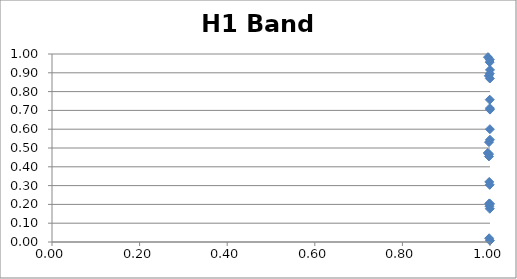
| Category | H1 Band 5 |
|---|---|
| 0.994834886025575 | 0.473 |
| 0.9953766164735058 | 0.983 |
| 0.9972801019672811 | 0.884 |
| 0.9976697690615814 | 0.531 |
| 0.9976730948771776 | 0.455 |
| 0.9979310104615164 | 0.467 |
| 0.9980324808185859 | 0.02 |
| 0.9982690949720863 | 0.319 |
| 0.9984354006671265 | 0.205 |
| 0.9987275360782343 | 0.19 |
| 0.9991885087208351 | 0.957 |
| 0.9993378741743699 | 0.304 |
| 0.9993947804459166 | 0.757 |
| 0.9995227555283397 | 0.896 |
| 0.9995242620840166 | 0.177 |
| 0.999608160821927 | 0.87 |
| 0.9996786930127619 | 0.97 |
| 0.9997469251263381 | 0.6 |
| 0.9997480220691844 | 0.712 |
| 0.9998563154647021 | 0.007 |
| 0.9999393745145014 | 0.544 |
| 0.9999847993091571 | 0.203 |
| 0.9999958368666434 | 0.915 |
| 0.9999965880209781 | 0.704 |